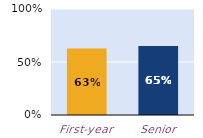
| Category | substantially |
|---|---|
| First-year | 0.627 |
| Senior | 0.652 |